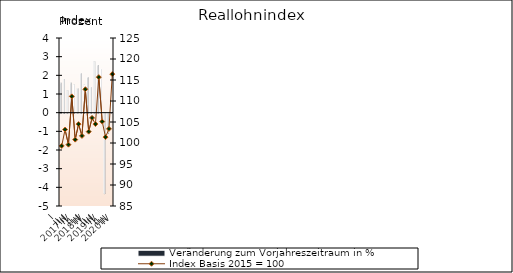
| Category | Veränderung zum Vorjahreszeitraum in % |
|---|---|
| 0 | 1.6 |
| 1 | 1.8 |
| 2 | 1.2 |
| 3 | 1.6 |
| 4 | 1.5 |
| 5 | 1.3 |
| 6 | 2.1 |
| 7 | 1.5 |
| 8 | 1.903 |
| 9 | 1.377 |
| 10 | 2.751 |
| 11 | 2.55 |
| 12 | 2.343 |
| 13 | -4.307 |
| 14 | -1.089 |
| 15 | 0.626 |